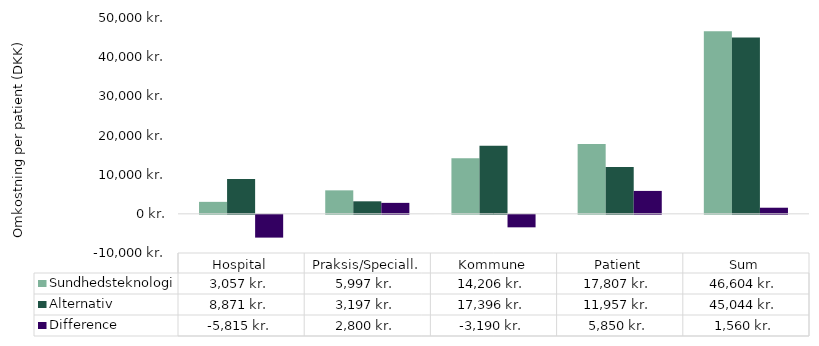
| Category | Sundhedsteknologi | Alternativ  | Difference |
|---|---|---|---|
| Hospital | 3056.509 | 8871.405 | -5814.895 |
| Praksis/Speciall. | 5997.46 | 3197.46 | 2800 |
| Kommune | 14205.72 | 17395.75 | -3190.03 |
| Patient | 17807 | 11957 | 5850 |
| Sum | 46603.724 | 45044.115 | 1559.609 |